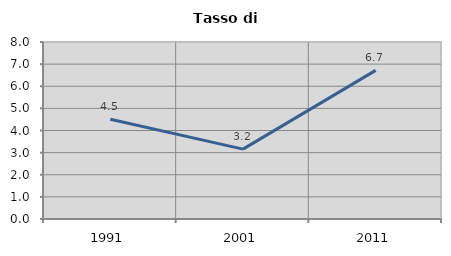
| Category | Tasso di disoccupazione   |
|---|---|
| 1991.0 | 4.511 |
| 2001.0 | 3.157 |
| 2011.0 | 6.717 |